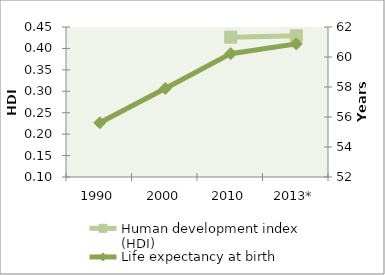
| Category | Human development index (HDI) |
|---|---|
| 1990 | 0 |
| 2000 | 0 |
| 2010 | 0.426 |
| 2013* | 0.429 |